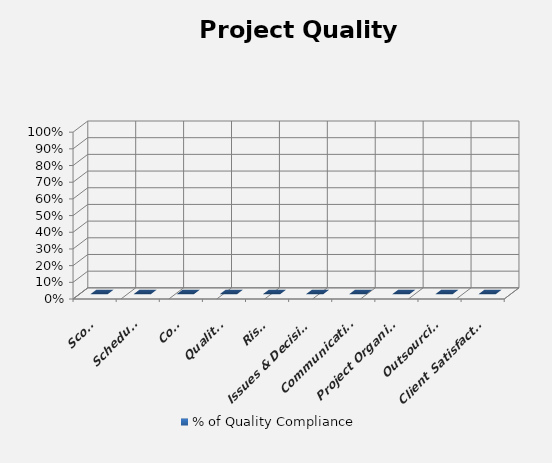
| Category | % of Quality Compliance |
|---|---|
| Scope | 0 |
| Schedule | 0 |
| Cost | 0 |
| Quality  | 0 |
| Risk  | 0 |
| Issues & Decisions | 0 |
| Communication | 0 |
| Project Organisation  | 0 |
| Outsourcing | 0 |
| Client Satisfaction | 0 |